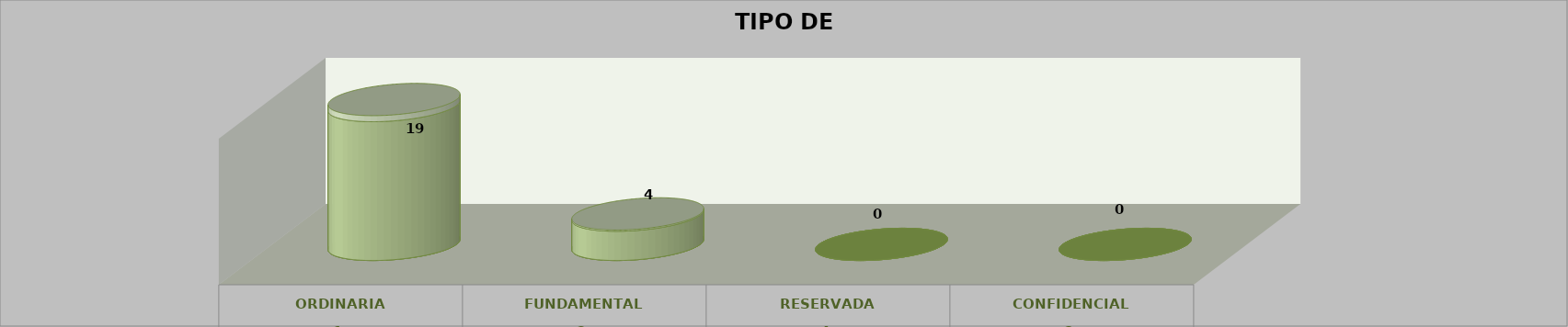
| Category | Series 0 | Series 2 | Series 1 | Series 3 | Series 4 |
|---|---|---|---|---|---|
| 0 |  |  |  | 19 | 0.826 |
| 1 |  |  |  | 4 | 0.174 |
| 2 |  |  |  | 0 | 0 |
| 3 |  |  |  | 0 | 0 |